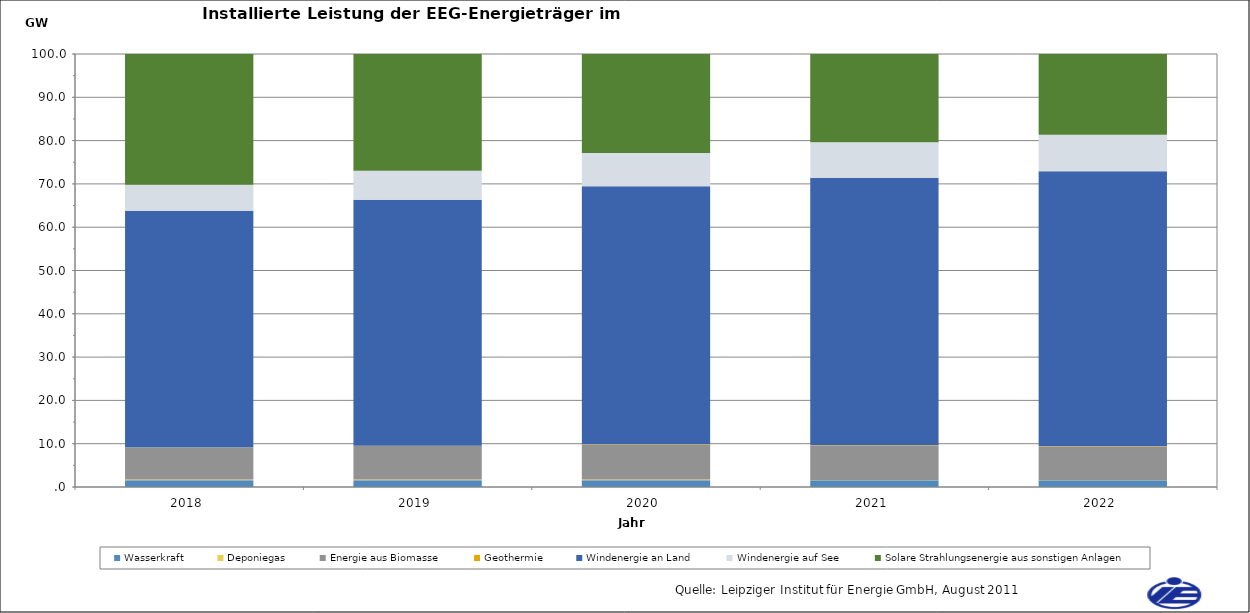
| Category | Wasserkraft | Deponiegas | Energie aus Biomasse | Geothermie | Windenergie an Land | Windenergie auf See | Solare Strahlungsenergie aus sonstigen Anlagen |
|---|---|---|---|---|---|---|---|
| 2018.0 | 1551.44 | 174.828 | 7432.136 | 47.085 | 54619.361 | 5982.008 | 31622.718 |
| 2019.0 | 1554.139 | 173.381 | 7743.036 | 62.085 | 56831.919 | 6687.008 | 33345.528 |
| 2020.0 | 1556.838 | 171.934 | 8056.716 | 66.085 | 59614.98 | 7675.808 | 35233.378 |
| 2021.0 | 1559.538 | 83.714 | 7899.553 | 73.085 | 61825.824 | 8185.808 | 37133.745 |
| 2022.0 | 1562.237 | 62.668 | 7786.537 | 73.085 | 63454.793 | 8425.808 | 38708.181 |